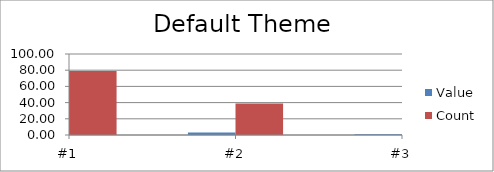
| Category | Value | Count |
|---|---|---|
| #1 | 5 | 79 |
| #2 | 3 | 39 |
| #3 | 1 | 35 |